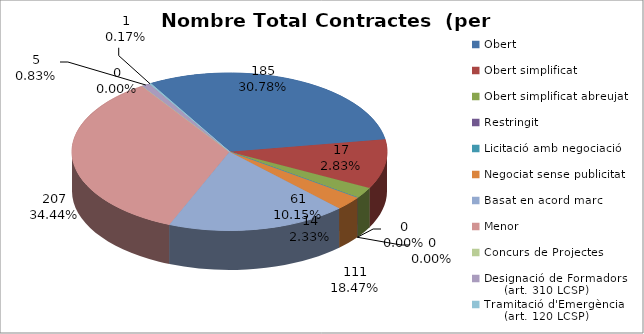
| Category | Nombre Total Contractes |
|---|---|
| Obert | 185 |
| Obert simplificat | 61 |
| Obert simplificat abreujat | 14 |
| Restringit | 0 |
| Licitació amb negociació | 0 |
| Negociat sense publicitat | 17 |
| Basat en acord marc | 111 |
| Menor | 207 |
| Concurs de Projectes | 0 |
| Designació de Formadors
     (art. 310 LCSP) | 5 |
| Tramitació d'Emergència
     (art. 120 LCSP) | 1 |